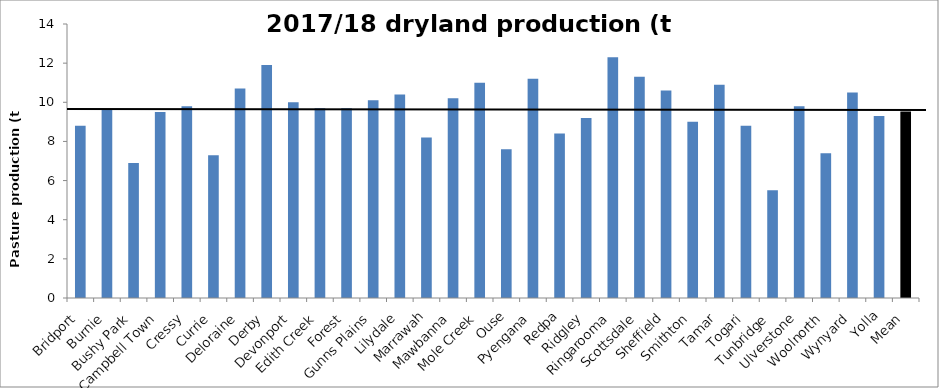
| Category | 2017/18 dryland production (t DM/ha) |
|---|---|
| Bridport | 8.8 |
| Burnie | 9.6 |
| Bushy Park | 6.9 |
| Campbell Town | 9.5 |
| Cressy | 9.8 |
| Currie | 7.3 |
| Deloraine | 10.7 |
| Derby | 11.9 |
| Devonport | 10 |
| Edith Creek | 9.7 |
| Forest | 9.7 |
| Gunns Plains | 10.1 |
| Lilydale | 10.4 |
| Marrawah | 8.2 |
| Mawbanna | 10.2 |
| Mole Creek | 11 |
| Ouse | 7.6 |
| Pyengana | 11.2 |
| Redpa | 8.4 |
| Ridgley | 9.2 |
| Ringarooma | 12.3 |
| Scottsdale | 11.3 |
| Sheffield | 10.6 |
| Smithton | 9 |
| Tamar | 10.9 |
| Togari | 8.8 |
| Tunbridge | 5.5 |
| Ulverstone | 9.8 |
| Woolnorth | 7.4 |
| Wynyard | 10.5 |
| Yolla | 9.3 |
| Mean | 9.535 |